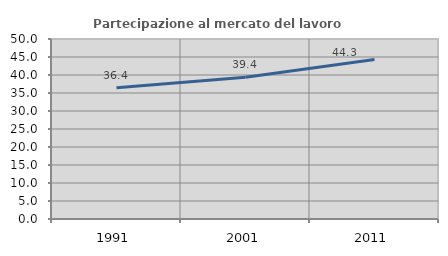
| Category | Partecipazione al mercato del lavoro  femminile |
|---|---|
| 1991.0 | 36.444 |
| 2001.0 | 39.362 |
| 2011.0 | 44.325 |